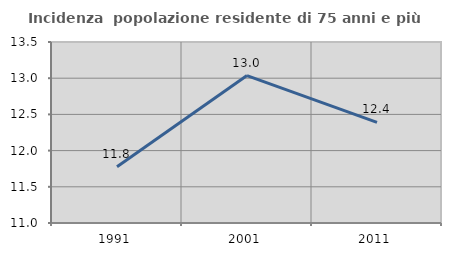
| Category | Incidenza  popolazione residente di 75 anni e più |
|---|---|
| 1991.0 | 11.776 |
| 2001.0 | 13.036 |
| 2011.0 | 12.389 |